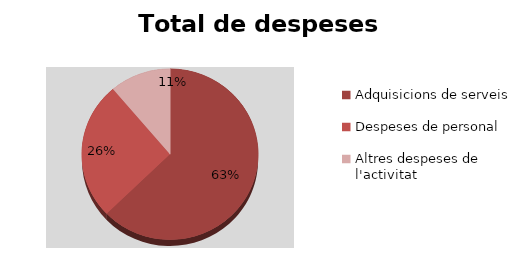
| Category | Series 0 |
|---|---|
| Adquisicions de serveis | 95526.93 |
| Despeses de personal | 39724.42 |
| Altres despeses de l'activitat | 17036.98 |